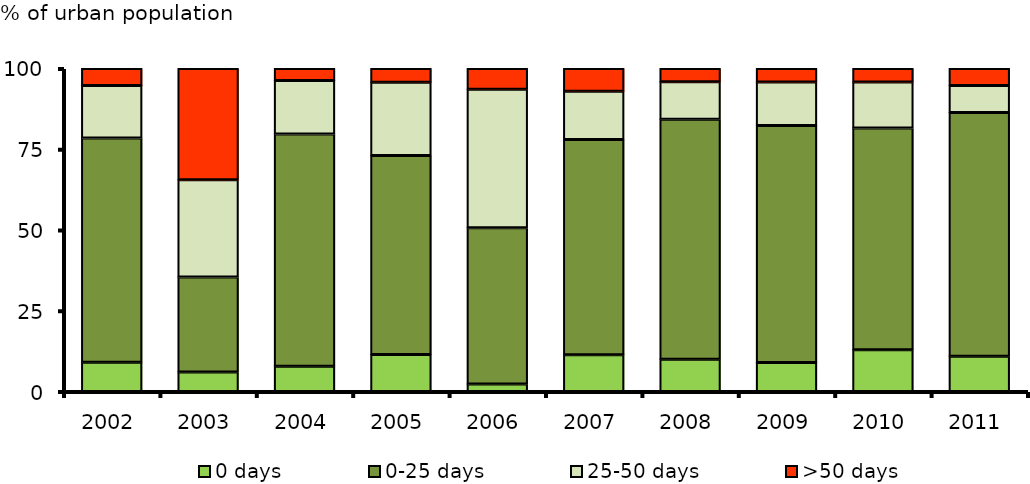
| Category | 0 days | 0-25 days | 25-50 days | >50 days |
|---|---|---|---|---|
| 2002.0 | 9.048 | 69.464 | 16.21 | 5.278 |
| 2003.0 | 6.071 | 29.393 | 30.122 | 34.414 |
| 2004.0 | 7.805 | 71.936 | 16.571 | 3.688 |
| 2005.0 | 11.45 | 61.635 | 22.648 | 4.266 |
| 2006.0 | 2.292 | 48.392 | 42.913 | 6.403 |
| 2007.0 | 11.366 | 66.641 | 14.918 | 7.076 |
| 2008.0 | 9.963 | 74.333 | 11.581 | 4.123 |
| 2009.0 | 9.003 | 73.316 | 13.53 | 4.15 |
| 2010.0 | 12.907 | 68.668 | 14.22 | 4.205 |
| 2011.0 | 10.933 | 75.439 | 8.352 | 5.276 |